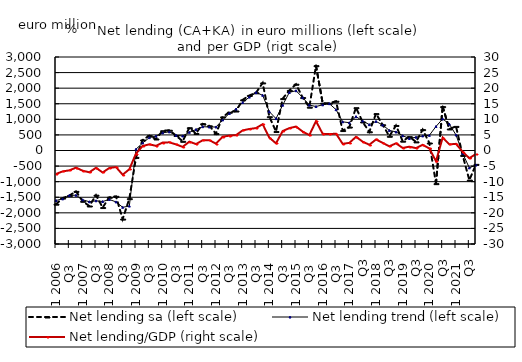
| Category | Net lending sa (left scale) | Net lending trend (left scale) |
|---|---|---|
| Q1 2006 | -1721.649 | -1603.676 |
| Q2  | -1526.667 | -1552.101 |
| Q3  | -1447.369 | -1440.885 |
| Q4  | -1311.543 | -1433.829 |
| Q1 2007 | -1629.162 | -1581.132 |
| Q2  | -1781.21 | -1644.436 |
| Q3  | -1433.42 | -1612.632 |
| Q4  | -1830.694 | -1636.824 |
| Q1 2008 | -1500.918 | -1572.002 |
| Q2  | -1470.853 | -1649.203 |
| Q3  | -2200.483 | -1822.737 |
| Q4  | -1546.12 | -1782.939 |
| Q1 2009 | -221.424 | 43.662 |
| Q2  | 338.326 | 242.559 |
| Q3  | 476.168 | 413.516 |
| Q4  | 369.495 | 463.605 |
| Q1 2010 | 634.074 | 566.659 |
| Q2  | 650.166 | 598.365 |
| Q3  | 481.364 | 487.384 |
| Q4  | 294.856 | 466.802 |
| Q1 2011 | 730.402 | 583.632 |
| Q2  | 544.908 | 675.224 |
| Q3  | 856.529 | 764.297 |
| Q4  | 792.104 | 754.438 |
| Q1 2012 | 541.478 | 755.511 |
| Q2  | 1077.981 | 981.765 |
| Q3  | 1227.706 | 1188.747 |
| Q4  | 1266.425 | 1331.411 |
| Q1 2013 | 1625.229 | 1541.963 |
| Q2  | 1765.971 | 1713.989 |
| Q3  | 1851.153 | 1859.05 |
| Q4  | 2168.729 | 1772.487 |
| Q1 2014 | 1084.712 | 1245.063 |
| Q2  | 608.184 | 1023.729 |
| Q3  | 1664.74 | 1454.614 |
| Q4  | 1927.28 | 1863.533 |
| Q1 2015 | 2126.616 | 1918.778 |
| Q2  | 1698.269 | 1697.592 |
| Q3  | 1389.937 | 1456.636 |
| Q4 | 2720.921 | 1411.187 |
| Q1 2016 | 1518.774 | 1466.059 |
| Q2  | 1516.82 | 1503.391 |
| Q3  | 1580.846 | 1311.005 |
| Q4 | 639.475 | 920.074 |
| Q1 2017 | 751.357 | 891.757 |
| Q2  | 1372.744 | 1087.364 |
| Q3 | 915.351 | 948.382 |
| Q4 | 600.532 | 829.875 |
| Q1 2018 | 1182.075 | 933.98 |
| Q2  | 825.643 | 818.668 |
| Q3 | 456.433 | 645.094 |
| Q4 | 802.678 | 596.336 |
| Q1 2019 | 299.455 | 475.371 |
| Q2  | 443.388 | 385.671 |
| Q3 | 276.712 | 427.444 |
| Q4 | 669.334 | 468.315 |
| Q1 2020 | 240.519 | 486.421 |
| Q2  | -1063.729 | 771.803 |
| Q3 | 1407.485 | 1013.037 |
| Q4 | 691.009 | 847.436 |
| Q1 2021 | 773.072 | 498.733 |
| Q2  | -157.635 | -93.957 |
| Q3 | -949.407 | -555.577 |
| Q4 | -444.749 | -467.129 |